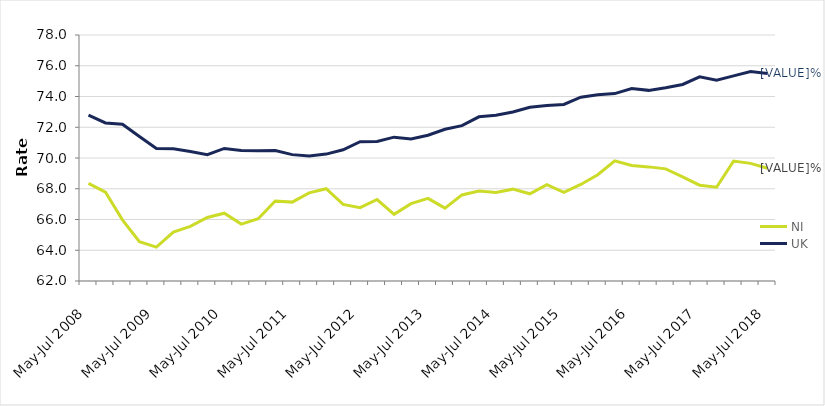
| Category | NI | UK |
|---|---|---|
| May-Jul 2008 | 68.347 | 72.787 |
| Aug-Oct 2008 | 67.774 | 72.28 |
| Nov-Jan 2009 | 65.977 | 72.194 |
| Feb-Apr 2009 | 64.562 | 71.396 |
| May-Jul 2009 | 64.206 | 70.615 |
| Aug-Oct 2009 | 65.187 | 70.6 |
| Nov-Jan 2010 | 65.558 | 70.416 |
| Feb-Apr 2010 | 66.133 | 70.214 |
| May-Jul 2010 | 66.41 | 70.621 |
| Aug-Oct 2010 | 65.703 | 70.49 |
| Nov-Jan 2011 | 66.046 | 70.469 |
| Feb-Apr 2011 | 67.208 | 70.482 |
| May-Jul 2011 | 67.131 | 70.22 |
| Aug-Oct 2011 | 67.731 | 70.124 |
| Nov-Jan 2012 | 68.002 | 70.253 |
| Feb-Apr 2012 | 66.985 | 70.532 |
| May-Jul 2012 | 66.768 | 71.06 |
| Aug-Oct 2012 | 67.3 | 71.07 |
| Nov-Jan 2013 | 66.337 | 71.356 |
| Feb-Apr 2013 | 67.032 | 71.234 |
| May-Jul 2013 | 67.372 | 71.48 |
| Aug-Oct 2013 | 66.742 | 71.868 |
| Nov-Jan 2014 | 67.599 | 72.105 |
| Feb-Apr 2014 | 67.852 | 72.678 |
| May-Jul 2014 | 67.76 | 72.781 |
| Aug-Oct 2014 | 67.974 | 72.989 |
| Nov-Jan 2015 | 67.673 | 73.305 |
| Feb-Apr 2015 | 68.262 | 73.419 |
| May-Jul 2015 | 67.763 | 73.481 |
| Aug-Oct 2015 | 68.279 | 73.952 |
| Nov-Jan 2016 | 68.909 | 74.112 |
| Feb-Apr 2016 | 69.814 | 74.188 |
| May-Jul 2016 | 69.509 | 74.521 |
| Aug-Oct 2016 | 69.422 | 74.399 |
| Nov-Jan 2017 | 69.293 | 74.574 |
| Feb-Apr 2017 | 68.77 | 74.783 |
| May-Jul 2017 | 68.233 | 75.277 |
| Aug-Oct 2017 | 68.1 | 75.066 |
| Nov-Jan 2018 | 69.801 | 75.339 |
| Feb-Apr 2018 | 69.651 | 75.629 |
| May-Jul 2018 | 69.331 | 75.502 |